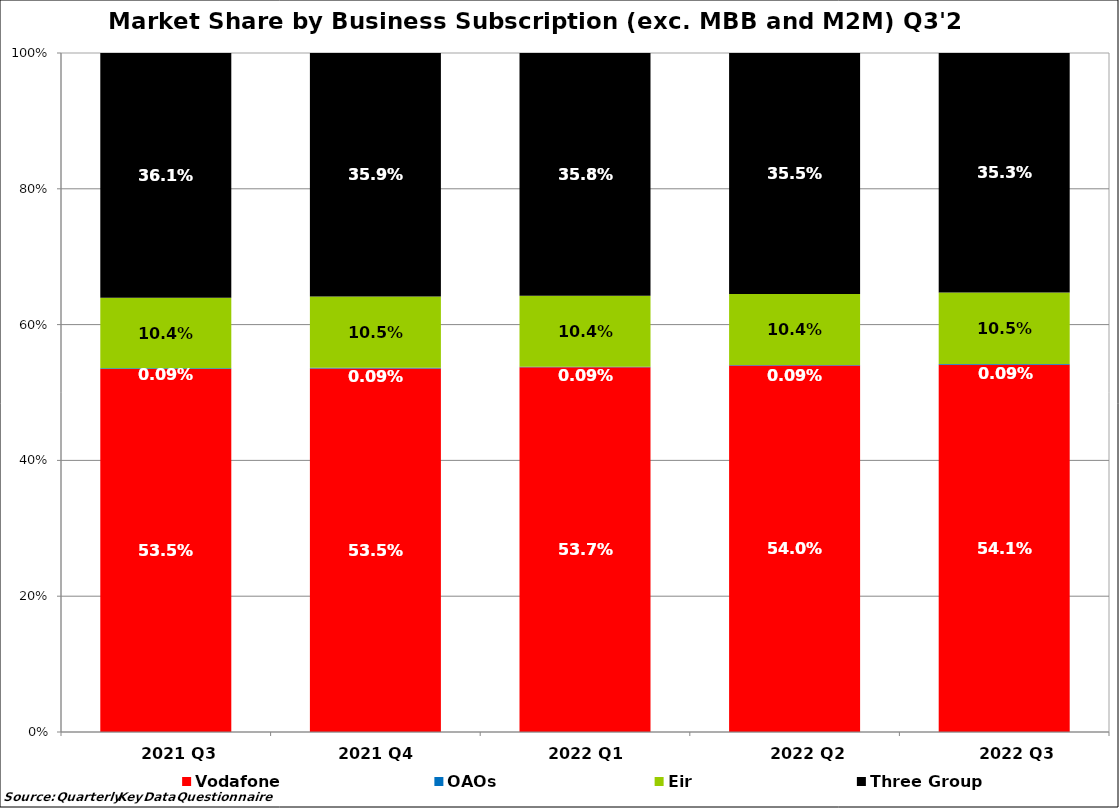
| Category | Vodafone | OAOs | Eir  | Three Group |
|---|---|---|---|---|
| 2021 Q3 | 0.535 | 0.001 | 0.104 | 0.361 |
| 2021 Q4  | 0.535 | 0.001 | 0.105 | 0.359 |
| 2022 Q1  | 0.537 | 0.001 | 0.104 | 0.358 |
| 2022 Q2 | 0.54 | 0.001 | 0.104 | 0.355 |
| 2022 Q3 | 0.541 | 0.001 | 0.105 | 0.353 |